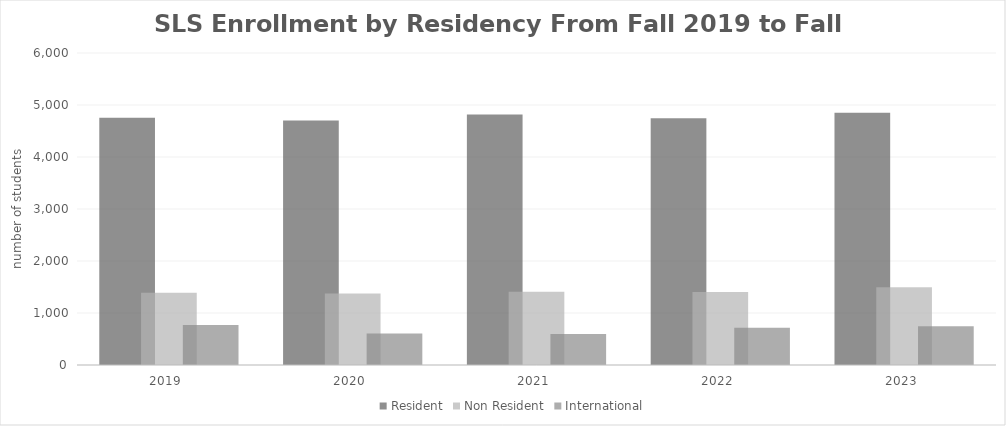
| Category | Resident | Non Resident | International |
|---|---|---|---|
| 2019  | 4755 | 1389 | 768 |
| 2020  | 4704 | 1376 | 607 |
| 2021  | 4818 | 1408 | 598 |
| 2022  | 4745 | 1404 | 714 |
| 2023  | 4849 | 1494 | 747 |